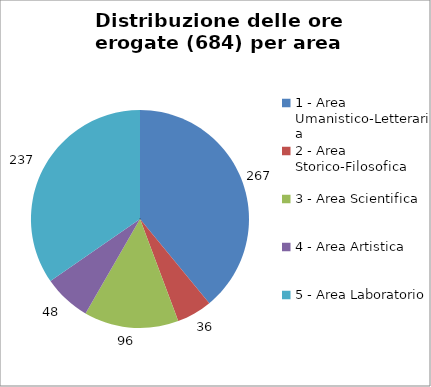
| Category | Nr. Ore Erogate |
|---|---|
| 1 - Area Umanistico-Letteraria | 267 |
| 2 - Area Storico-Filosofica | 36 |
| 3 - Area Scientifica | 96 |
| 4 - Area Artistica | 48 |
| 5 - Area Laboratorio | 237 |